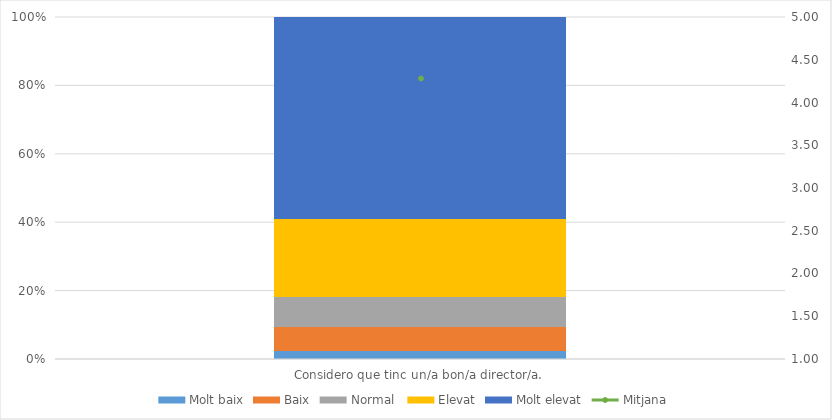
| Category | Molt baix | Baix | Normal  | Elevat | Molt elevat |
|---|---|---|---|---|---|
| Considero que tinc un/a bon/a director/a. | 3 | 8 | 10 | 26 | 67 |